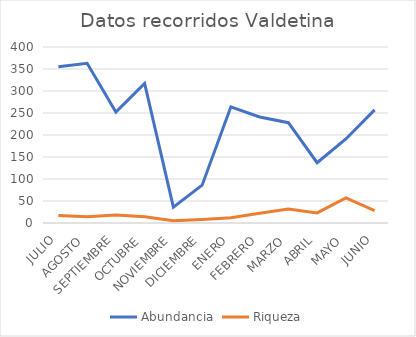
| Category | Abundancia | Riqueza |
|---|---|---|
| JULIO | 355 | 17 |
| AGOSTO | 363 | 14 |
| SEPTIEMBRE | 252 | 18 |
| OCTUBRE | 317 | 14 |
| NOVIEMBRE | 36 | 5 |
| DICIEMBRE | 86 | 8 |
| ENERO | 264 | 12 |
| FEBRERO | 241 | 22 |
| MARZO | 228 | 32 |
| ABRIL | 137 | 23 |
| MAYO | 191 | 57 |
| JUNIO | 257 | 28 |